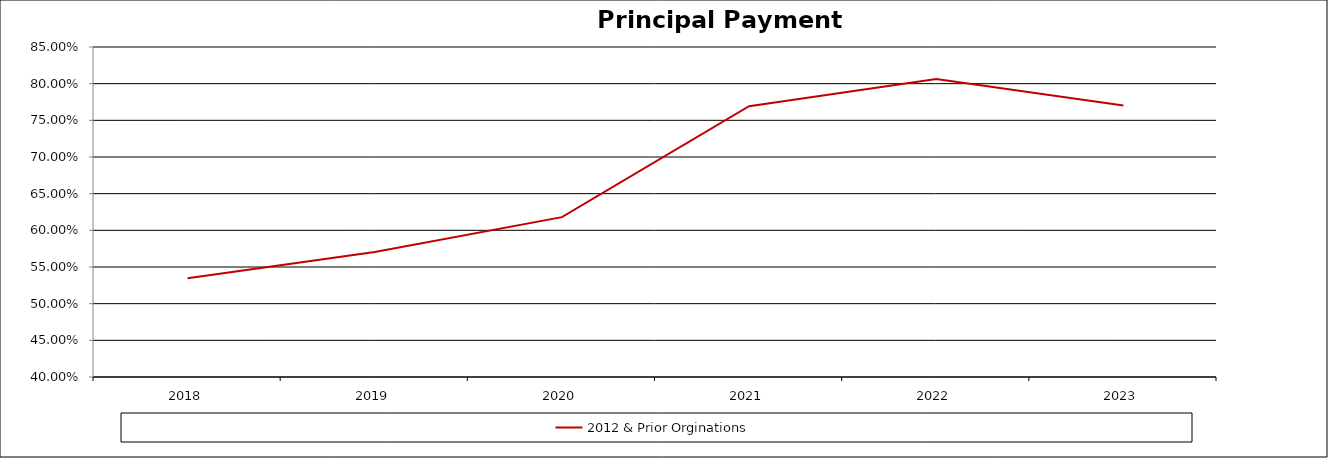
| Category | 2012 & Prior Orginations |
|---|---|
| 2018 | 0.535 |
| 2019 | 0.57 |
| 2020 | 0.618 |
| 2021 | 0.769 |
| 2022 | 0.806 |
| 2023 | 0.77 |